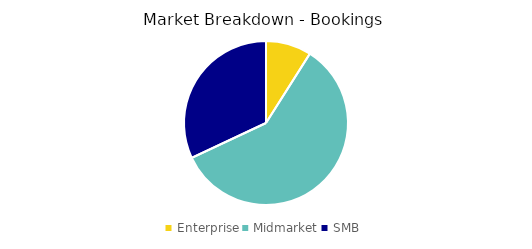
| Category | Series 0 |
|---|---|
| Enterprise | 1220750.067 |
| Midmarket | 8031254.753 |
| SMB | 4349047.546 |